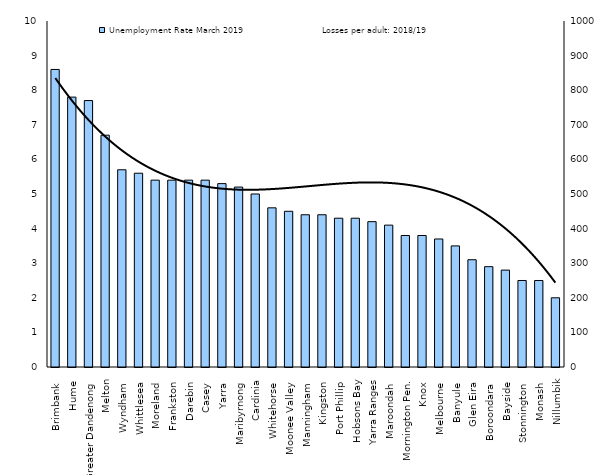
| Category | Unemployment Rate March 2019 |
|---|---|
| Brimbank  | 8.6 |
| Hume  | 7.8 |
| Greater Dandenong  | 7.7 |
| Melton | 6.7 |
| Wyndham  | 5.7 |
| Whittlesea  | 5.6 |
| Moreland  | 5.4 |
| Frankston  | 5.4 |
| Darebin  | 5.4 |
| Casey  | 5.4 |
| Yarra  | 5.3 |
| Maribyrnong  | 5.2 |
| Cardinia | 5 |
| Whitehorse  | 4.6 |
| Moonee Valley  | 4.5 |
| Manningham  | 4.4 |
| Kingston  | 4.4 |
| Port Phillip  | 4.3 |
| Hobsons Bay | 4.3 |
| Yarra Ranges | 4.2 |
| Maroondah  | 4.1 |
| Mornington Pen. | 3.8 |
| Knox  | 3.8 |
| Melbourne  | 3.7 |
| Banyule  | 3.5 |
| Glen Eira  | 3.1 |
| Boroondara  | 2.9 |
| Bayside  | 2.8 |
| Stonnington  | 2.5 |
| Monash  | 2.5 |
| Nillumbik | 2 |